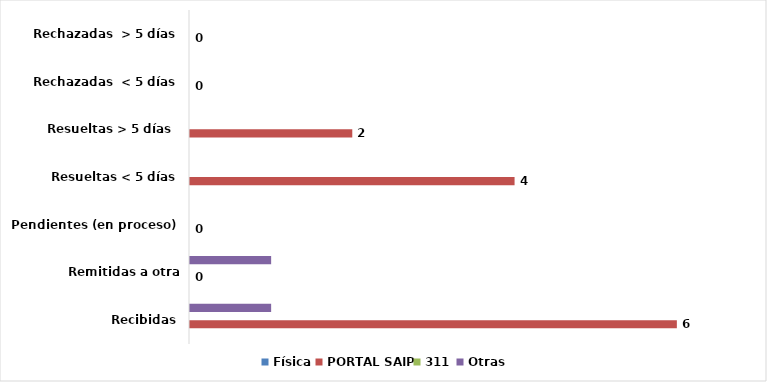
| Category | Física | PORTAL SAIP | 311 | Otras |
|---|---|---|---|---|
| Recibidas | 0 | 6 | 0 | 1 |
| Remitidas a otra institución | 0 | 0 | 0 | 1 |
| Pendientes (en proceso) | 0 | 0 | 0 | 0 |
| Resueltas < 5 días | 0 | 4 | 0 | 0 |
| Resueltas > 5 días  | 0 | 2 | 0 | 0 |
| Rechazadas  < 5 días | 0 | 0 | 0 | 0 |
| Rechazadas  > 5 días | 0 | 0 | 0 | 0 |